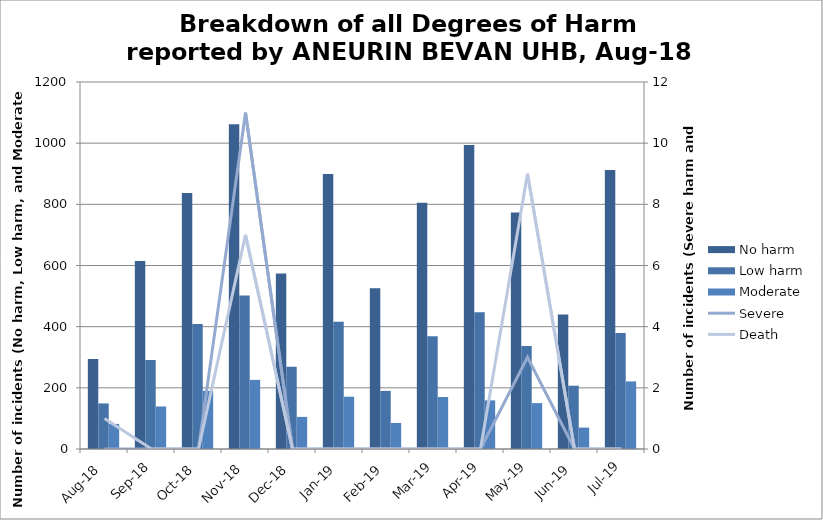
| Category | No harm | Low harm | Moderate |
|---|---|---|---|
| Aug-18 | 294 | 149 | 82 |
| Sep-18 | 615 | 291 | 139 |
| Oct-18 | 837 | 409 | 190 |
| Nov-18 | 1062 | 502 | 226 |
| Dec-18 | 574 | 269 | 105 |
| Jan-19 | 899 | 416 | 171 |
| Feb-19 | 526 | 190 | 85 |
| Mar-19 | 805 | 369 | 170 |
| Apr-19 | 994 | 447 | 159 |
| May-19 | 773 | 337 | 150 |
| Jun-19 | 440 | 207 | 70 |
| Jul-19 | 912 | 379 | 221 |